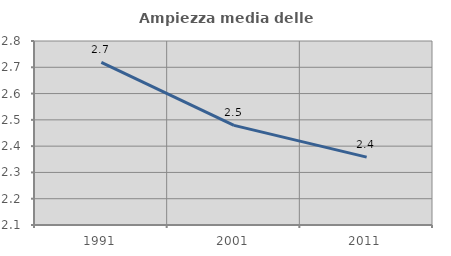
| Category | Ampiezza media delle famiglie |
|---|---|
| 1991.0 | 2.719 |
| 2001.0 | 2.479 |
| 2011.0 | 2.358 |